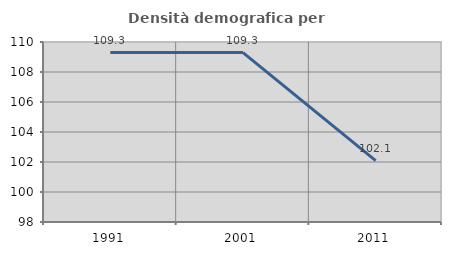
| Category | Densità demografica |
|---|---|
| 1991.0 | 109.295 |
| 2001.0 | 109.295 |
| 2011.0 | 102.092 |